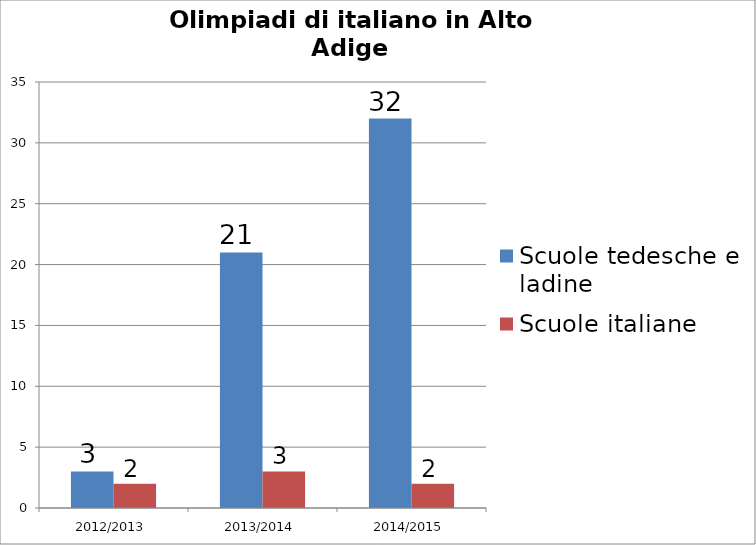
| Category | Scuole tedesche e ladine | Scuole italiane |
|---|---|---|
| 2012/2013 | 3 | 2 |
| 2013/2014 | 21 | 3 |
| 2014/2015 | 32 | 2 |